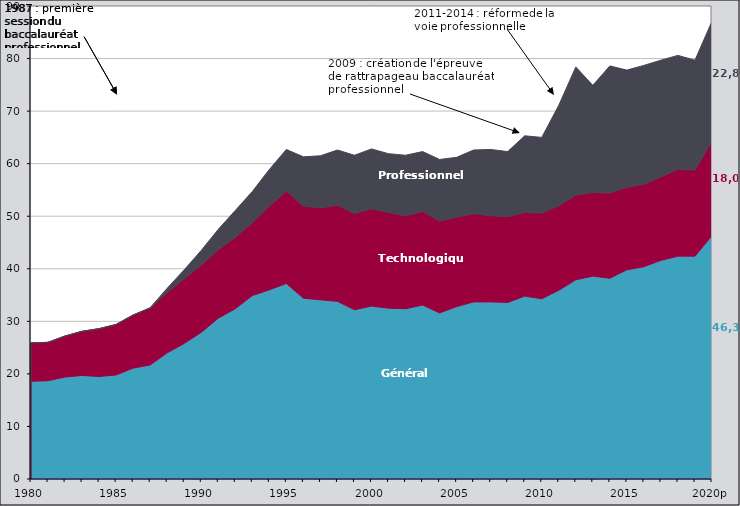
| Category | Général | Technologique | Professionnel |
|---|---|---|---|
| 1980 | 18.6 | 7.3 | 0 |
| 1981 | 18.7 | 7.3 | 0 |
| 1982 | 19.4 | 7.8 | 0 |
| 1983 | 19.7 | 8.4 | 0 |
| 1984 | 19.5 | 9.1 | 0 |
| 1985 | 19.8 | 9.6 | 0 |
| 1986 | 21.1 | 10.1 | 0 |
| 1987 | 21.7 | 10.8 | 0.1 |
| 1988 | 24 | 11.5 | 0.8 |
| 1989 | 25.8 | 12.3 | 1.7 |
| 1990 | 27.9 | 12.8 | 2.8 |
| 1991 | 30.6 | 13 | 3.9 |
| 1992 | 32.4 | 13.6 | 5.1 |
| 1993 | 34.9 | 13.9 | 5.9 |
| 1994 | 36 | 15.9 | 7 |
| 1995 | 37.2 | 17.6 | 7.9 |
| 1996 | 34.4 | 17.5 | 9.4 |
| 1997 | 34.1 | 17.5 | 9.9 |
| 1998 | 33.8 | 18.3 | 10.5 |
| 1999 | 32.2 | 18.3 | 11.1 |
| 2000 | 32.9 | 18.5 | 11.4 |
| 2001 | 32.5 | 18.2 | 11.2 |
| 2002 | 32.4 | 17.7 | 11.5 |
| 2003 | 33.1 | 17.8 | 11.4 |
| 2004 | 31.6 | 17.5 | 11.7 |
| 2005 | 32.8 | 17 | 11.4 |
| 2006 | 33.7 | 16.8 | 12.1 |
| 2007 | 33.7 | 16.4 | 12.6 |
| 2008 | 33.6 | 16.3 | 12.4 |
| 2009 | 34.8 | 15.9 | 14.6 |
| 2010 | 34.3 | 16.3 | 14.4 |
| 2011 | 35.9 | 16.1 | 19.1 |
| 2012 | 37.9 | 16.1 | 24.4 |
| 2013 | 38.6 | 15.9 | 20.4 |
| 2014 | 38.2 | 16.2 | 24.2 |
| 2015 | 39.8 | 15.7 | 22.3 |
| 2016 | 40.4 | 15.7 | 22.6 |
| 2017 | 41.6 | 15.9 | 22.2 |
| 2018 | 42.4 | 16.5 | 21.7 |
| 2019p | 42.4 | 16.4 | 20.9 |
| 2020p | 46.3 | 18 | 22.8 |